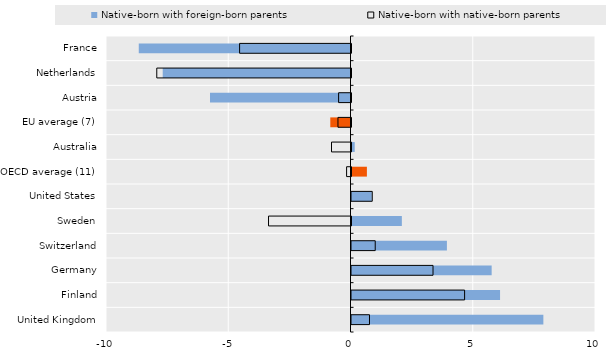
| Category | Native-born with foreign-born parents | Native-born with native-born parents |
|---|---|---|
| France | -8.66 | -4.556 |
| Netherlands | -7.68 | -7.944 |
| Austria | -5.746 | -0.507 |
| EU average (7) | -0.827 | -0.533 |
| Australia | 0.132 | -0.797 |
| OECD average (11) | 0.63 | -0.18 |
| United States | 0.831 | 0.849 |
| Sweden | 2.059 | -3.373 |
| Switzerland | 3.902 | 0.97 |
| Germany | 5.732 | 3.334 |
| Finland | 6.076 | 4.626 |
| United Kingdom | 7.847 | 0.736 |